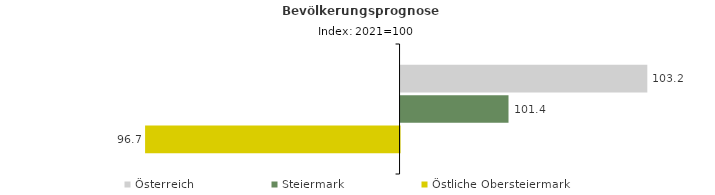
| Category | Österreich | Steiermark | Östliche Obersteiermark |
|---|---|---|---|
| 2021.0 | 103.2 | 101.4 | 96.7 |